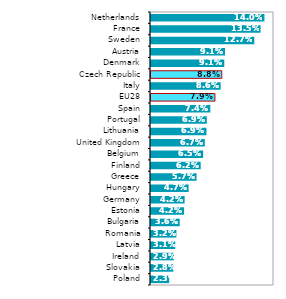
| Category | podíl na celkových investicích |
|---|---|
| Poland | 0.023 |
| Slovakia | 0.028 |
| Ireland | 0.029 |
| Latvia | 0.031 |
| Romania | 0.032 |
| Bulgaria | 0.036 |
| Estonia | 0.042 |
| Germany | 0.042 |
| Hungary | 0.047 |
| Greece | 0.057 |
| Finland | 0.062 |
| Belgium | 0.065 |
| United Kingdom | 0.067 |
| Lithuania | 0.069 |
| Portugal | 0.069 |
| Spain | 0.074 |
| EU28 | 0.079 |
| Italy | 0.086 |
| Czech Republic | 0.088 |
| Denmark | 0.091 |
| Austria | 0.091 |
| Sweden | 0.127 |
| France | 0.135 |
| Netherlands | 0.14 |